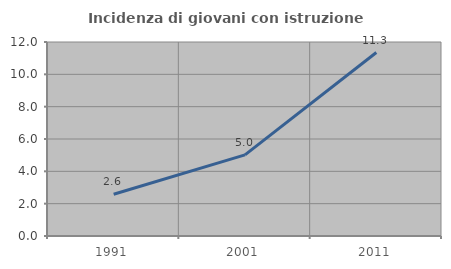
| Category | Incidenza di giovani con istruzione universitaria |
|---|---|
| 1991.0 | 2.586 |
| 2001.0 | 5.016 |
| 2011.0 | 11.35 |